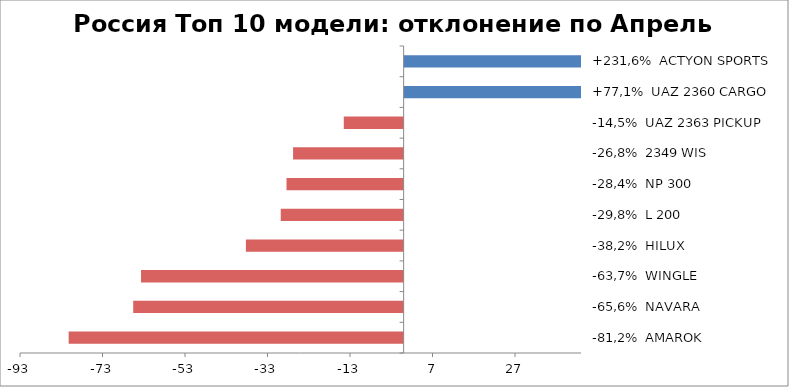
| Category | Россия Топ 10 модели: отклонение по Апрель 2015-2014 |
|---|---|
| -81,2%  AMAROK | -81.204 |
| -65,6%  NAVARA | -65.556 |
| -63,7%  WINGLE | -63.659 |
| -38,2%  HILUX | -38.235 |
| -29,8%  L 200 | -29.786 |
| -28,4%  NP 300 | -28.391 |
| -26,8%  2349 WIS | -26.797 |
| -14,5%  UAZ 2363 PICKUP | -14.509 |
| +77,1%  UAZ 2360 CARGO | 77.064 |
| +231,6%  ACTYON SPORTS | 231.579 |